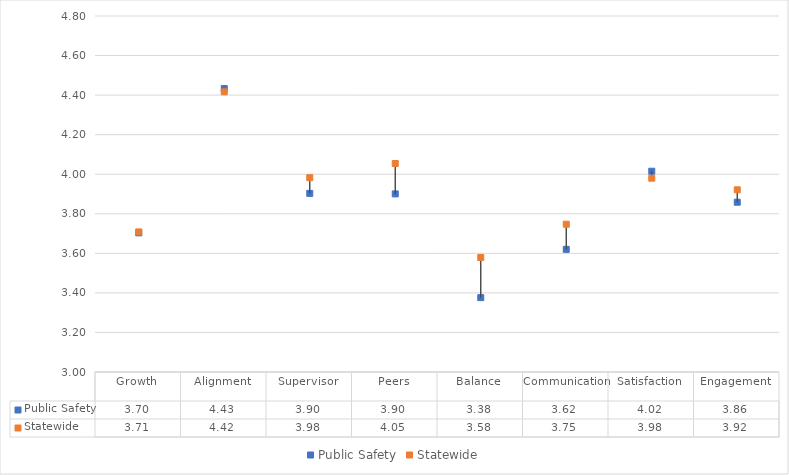
| Category | Public Safety | Statewide |
|---|---|---|
| Growth | 3.703 | 3.708 |
| Alignment | 4.433 | 4.417 |
| Supervisor | 3.903 | 3.983 |
| Peers | 3.901 | 4.054 |
| Balance | 3.376 | 3.579 |
| Communication | 3.62 | 3.747 |
| Satisfaction | 4.015 | 3.98 |
| Engagement | 3.858 | 3.921 |